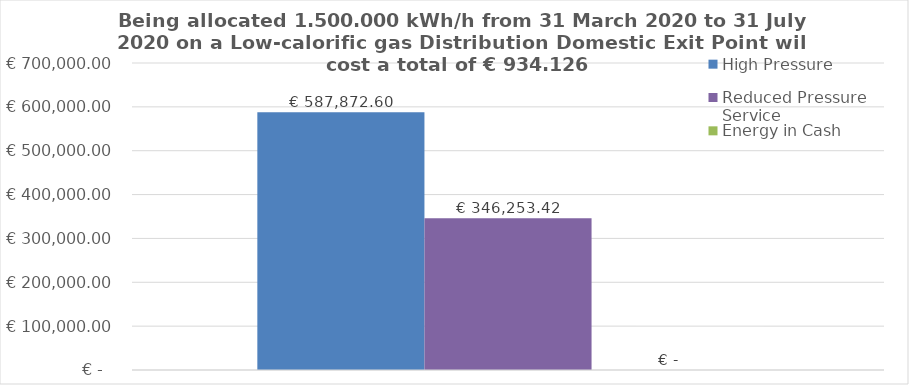
| Category | High Pressure | Reduced Pressure Service | Energy in Cash  |
|---|---|---|---|
|  | 587872.603 | 346253.425 | 0 |